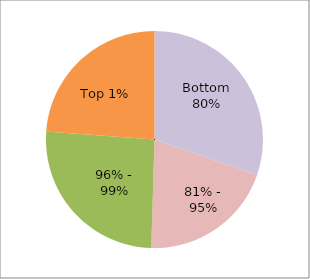
| Category | Series 0 |
|---|---|
| Bottom 80% | -71.033 |
| 81% - 95% | -47.18 |
| 96% - 99% | -60.197 |
| Top 1% | -55.788 |